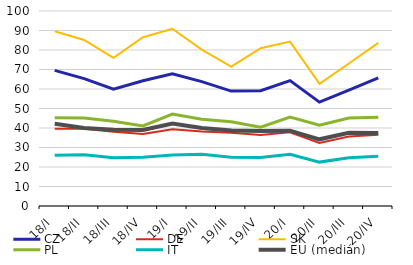
| Category | CZ | DE | SK | PL | IT | EU (medián) |
|---|---|---|---|---|---|---|
| 18/I | 69.557 | 39.616 | 89.63 | 45.257 | 26.003 | 42.141 |
| 18/II | 65.349 | 39.654 | 85.163 | 45.185 | 26.247 | 39.999 |
| 18/III | 59.933 | 38.025 | 75.967 | 43.51 | 24.761 | 39.074 |
| 18/IV | 64.241 | 36.875 | 86.533 | 41.024 | 24.942 | 38.994 |
| 19/I | 67.802 | 39.333 | 90.884 | 47.147 | 26.134 | 42.242 |
| 19/II | 63.794 | 38.184 | 80.169 | 44.528 | 26.588 | 39.998 |
| 19/III | 58.928 | 37.517 | 71.521 | 43.207 | 24.989 | 38.686 |
| 19/IV | 59.157 | 36.355 | 80.93 | 40.422 | 24.87 | 38.459 |
| 20/I | 64.312 | 37.801 | 84.321 | 45.609 | 26.482 | 38.629 |
| 20/II | 53.254 | 32.347 | 62.644 | 41.447 | 22.509 | 34.192 |
| 20/III | 59.399 | 35.651 | 73.075 | 45.136 | 24.794 | 37.59 |
| 20/IV | 65.664 | 36.583 | 83.676 | 45.522 | 25.535 | 37.444 |